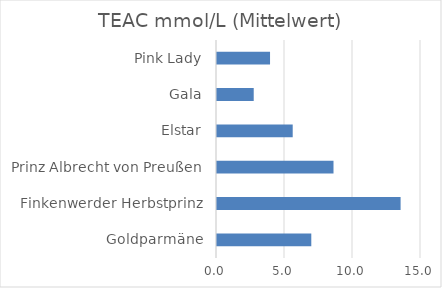
| Category | TEAC |
|---|---|
| Goldparmäne | 6.933 |
| Finkenwerder Herbstprinz | 13.5 |
| Prinz Albrecht von Preußen | 8.567 |
| Elstar | 5.567 |
| Gala | 2.7 |
| Pink Lady | 3.9 |